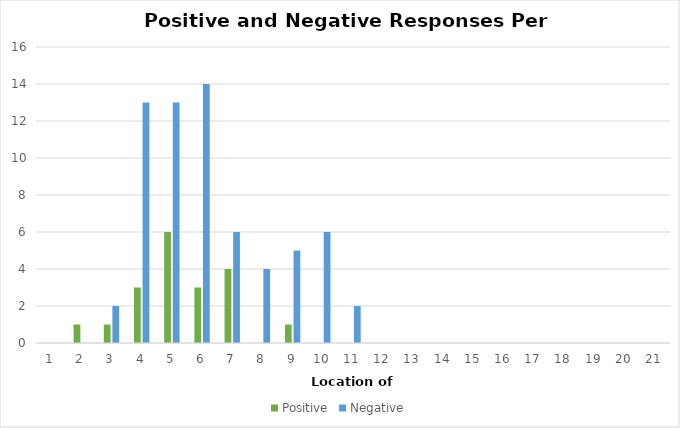
| Category | Positive | Negative |
|---|---|---|
| 1.0 | 0 | 0 |
| 2.0 | 1 | 0 |
| 3.0 | 1 | 2 |
| 4.0 | 3 | 13 |
| 5.0 | 6 | 13 |
| 6.0 | 3 | 14 |
| 7.0 | 4 | 6 |
| 8.0 | 0 | 4 |
| 9.0 | 1 | 5 |
| 10.0 | 0 | 6 |
| 11.0 | 0 | 2 |
| 12.0 | 0 | 0 |
| 13.0 | 0 | 0 |
| 14.0 | 0 | 0 |
| 15.0 | 0 | 0 |
| 16.0 | 0 | 0 |
| 17.0 | 0 | 0 |
| 18.0 | 0 | 0 |
| 19.0 | 0 | 0 |
| 20.0 | 0 | 0 |
| 21.0 | 0 | 0 |